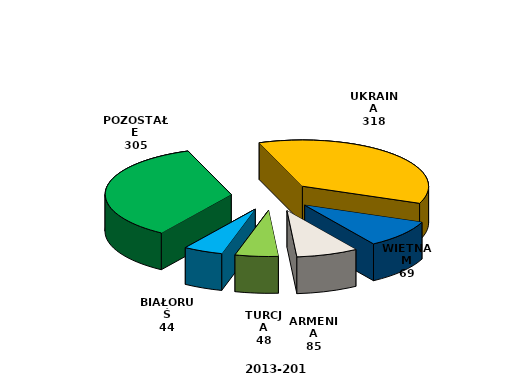
| Category | Series 0 |
|---|---|
| UKRAINA | 318 |
| ARMENIA | 85 |
| WIETNAM | 69 |
| TURCJA | 48 |
| BIAŁORUŚ | 44 |
| POZOSTAŁE | 305 |